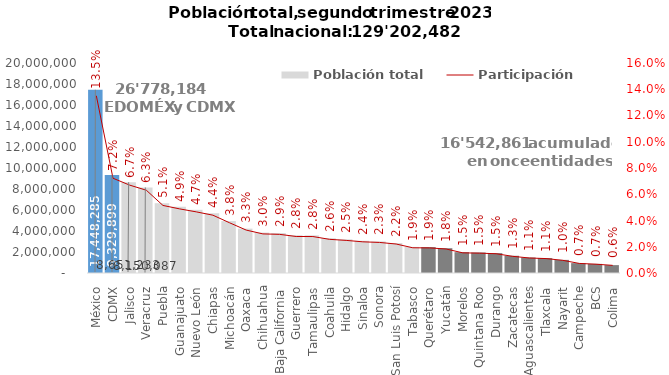
| Category | Población total |
|---|---|
| México | 17448285 |
| CDMX | 9329899 |
| Jalisco | 8651233 |
| Veracruz | 8150087 |
| Puebla | 6650039 |
| Guanajuato | 6311590 |
| Nuevo León | 6017578 |
| Chiapas | 5690779 |
| Michoacán | 4942489 |
| Oaxaca | 4223522 |
| Chihuahua | 3849572 |
| Baja California | 3803821 |
| Guerrero | 3593330 |
| Tamaulipas | 3589309 |
| Coahuila | 3314657 |
| Hidalgo | 3208574 |
| Sinaloa | 3070061 |
| Sonora | 3009990 |
| San Luis Potosí | 2853129 |
| Tabasco | 2482566 |
| Querétaro | 2469111 |
| Yucatán | 2362608 |
| Morelos | 1985017 |
| Quintana Roo | 1954809 |
| Durango | 1896140 |
| Zacatecas | 1640096 |
| Aguascalientes | 1475736 |
| Tlaxcala | 1419771 |
| Nayarit | 1248873 |
| Campeche | 941412 |
| BCS | 866661 |
| Colima | 751738 |